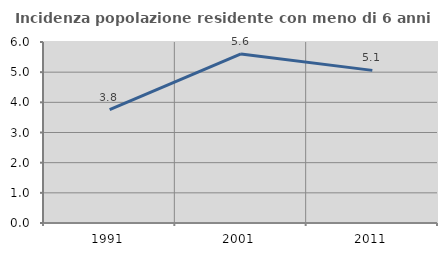
| Category | Incidenza popolazione residente con meno di 6 anni |
|---|---|
| 1991.0 | 3.761 |
| 2001.0 | 5.603 |
| 2011.0 | 5.06 |